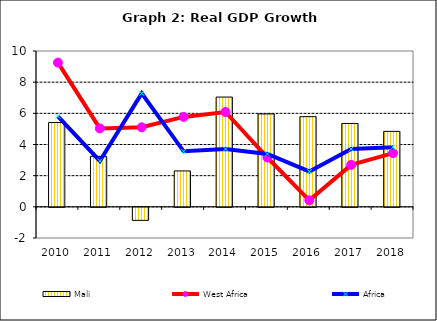
| Category | Mali |
|---|---|
| 2010.0 | 5.413 |
| 2011.0 | 3.24 |
| 2012.0 | -0.836 |
| 2013.0 | 2.304 |
| 2014.0 | 7.043 |
| 2015.0 | 5.963 |
| 2016.0 | 5.787 |
| 2017.0 | 5.351 |
| 2018.0 | 4.843 |